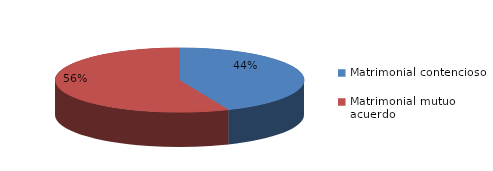
| Category | Series 0 |
|---|---|
| 0 | 92 |
| 1 | 119 |